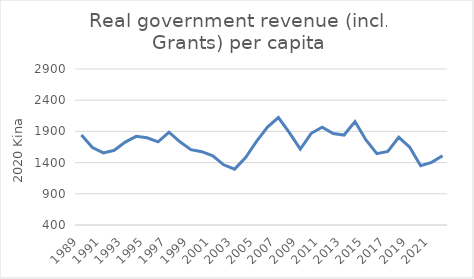
| Category | Real government revenue per capita |
|---|---|
| 1989.0 | 1842.109 |
| 1990.0 | 1640.271 |
| 1991.0 | 1554.348 |
| 1992.0 | 1596.916 |
| 1993.0 | 1728.537 |
| 1994.0 | 1821.312 |
| 1995.0 | 1798.568 |
| 1996.0 | 1733.456 |
| 1997.0 | 1887.909 |
| 1998.0 | 1733.101 |
| 1999.0 | 1607.72 |
| 2000.0 | 1574.835 |
| 2001.0 | 1509.395 |
| 2002.0 | 1364.879 |
| 2003.0 | 1294.948 |
| 2004.0 | 1479.969 |
| 2005.0 | 1741.466 |
| 2006.0 | 1969.56 |
| 2007.0 | 2121.908 |
| 2008.0 | 1880.934 |
| 2009.0 | 1615.317 |
| 2010.0 | 1869.623 |
| 2011.0 | 1968.435 |
| 2012.0 | 1866.407 |
| 2013.0 | 1841.698 |
| 2014.0 | 2058.138 |
| 2015.0 | 1763.358 |
| 2016.0 | 1543.668 |
| 2017.0 | 1578.069 |
| 2018.0 | 1806.002 |
| 2019.0 | 1647.688 |
| 2020.0 | 1350.96 |
| 2021.0 | 1403.604 |
| 2022.0 | 1510.696 |